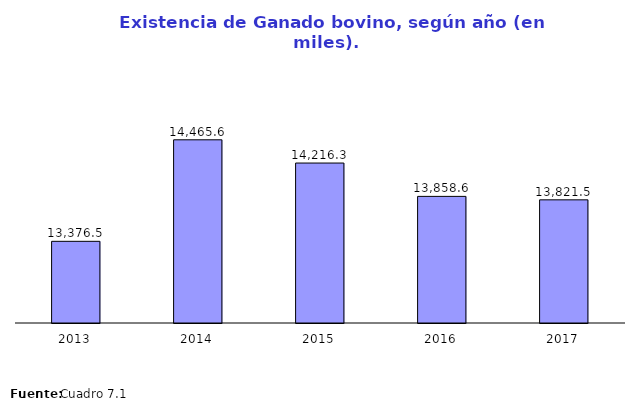
| Category | Total |
|---|---|
| 2013.0 | 13376.45 |
| 2014.0 | 14465.581 |
| 2015.0 | 14216.3 |
| 2016.0 | 13858.6 |
| 2017.0 | 13821.5 |